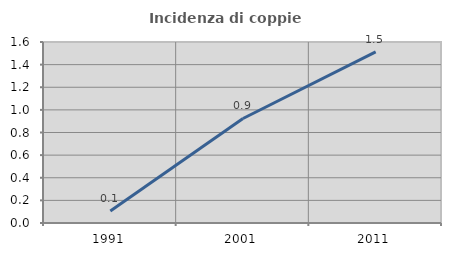
| Category | Incidenza di coppie miste |
|---|---|
| 1991.0 | 0.107 |
| 2001.0 | 0.924 |
| 2011.0 | 1.513 |